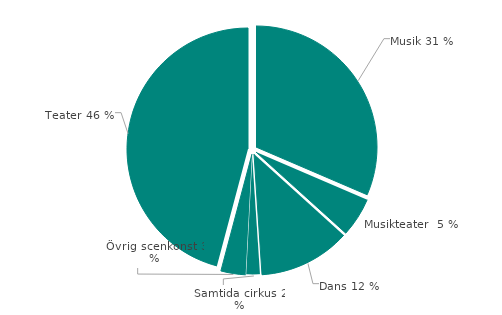
| Category | Antal  | Andel (%) |
|---|---|---|
| Musik | 12162 | 31.456 |
| Musikteater  | 2026 | 5.24 |
| Dans | 4735 | 12.247 |
| Samtida cirkus | 731 | 1.891 |
| Övrig scenkonst | 1277 | 3.303 |
| Teater | 17732 | 45.863 |